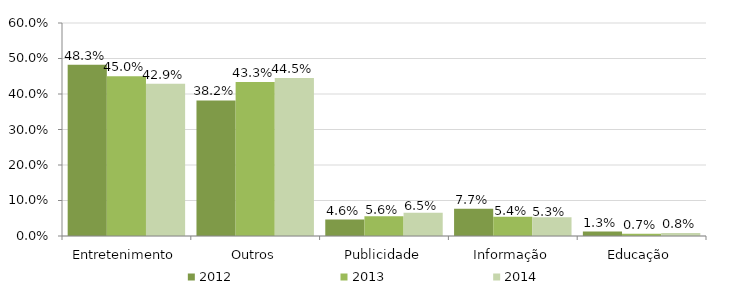
| Category | 2012 | 2013 | 2014 |
|---|---|---|---|
| Entretenimento | 0.483 | 0.45 | 0.429 |
| Outros | 0.382 | 0.433 | 0.445 |
| Publicidade | 0.046 | 0.056 | 0.065 |
| Informação | 0.077 | 0.054 | 0.053 |
| Educação | 0.013 | 0.007 | 0.008 |